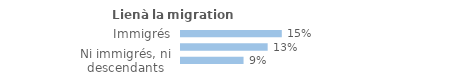
| Category | Series 0 |
|---|---|
| Immigrés | 0.15 |
| Descendants d'immigré(s) | 0.129 |
| Ni immigrés, ni descendants | 0.093 |